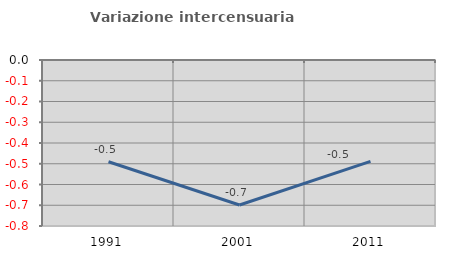
| Category | Variazione intercensuaria annua |
|---|---|
| 1991.0 | -0.49 |
| 2001.0 | -0.699 |
| 2011.0 | -0.488 |